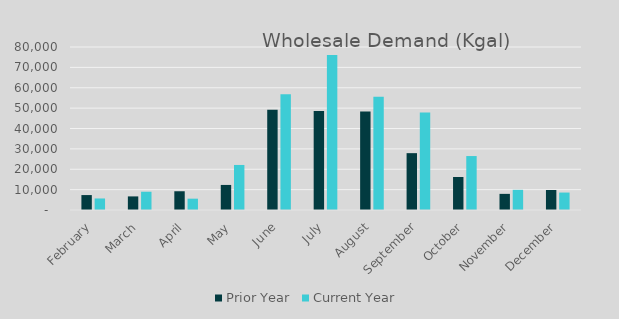
| Category | Prior Year | Current Year |
|---|---|---|
| February | 7328 | 5662 |
| March | 6673 | 8964 |
| April | 9201 | 5557 |
| May | 12299 | 22105 |
| June | 49180 | 56817 |
| July | 48620 | 76109 |
| August | 48323 | 55541 |
| September | 27902 | 47807 |
| October | 16206 | 26480 |
| November | 7918 | 9900 |
| December | 9824 | 8560 |